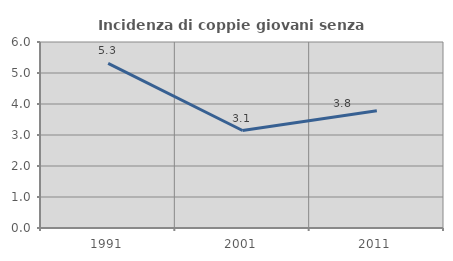
| Category | Incidenza di coppie giovani senza figli |
|---|---|
| 1991.0 | 5.31 |
| 2001.0 | 3.145 |
| 2011.0 | 3.779 |